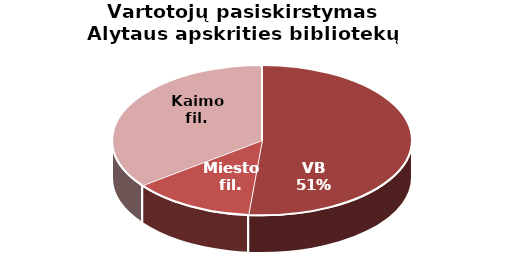
| Category | Vartotojų pasiskirstymas Alytaus apskrities bibliotekų padaliniuose |
|---|---|
| VB | 19121 |
| Miesto fil. | 4924 |
| Kaimo fil. | 13110 |